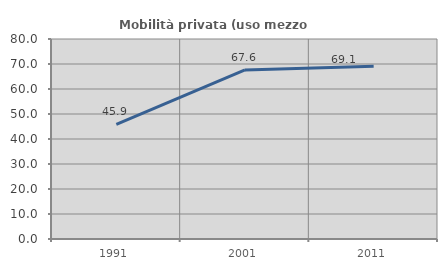
| Category | Mobilità privata (uso mezzo privato) |
|---|---|
| 1991.0 | 45.864 |
| 2001.0 | 67.627 |
| 2011.0 | 69.129 |